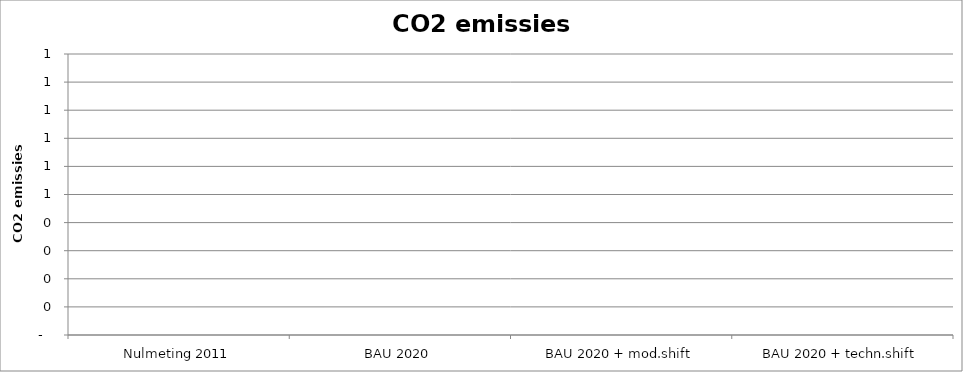
| Category | Series 0 |
|---|---|
| Nulmeting 2011 | 0 |
| BAU 2020 | 0 |
| BAU 2020 + mod.shift | 0 |
| BAU 2020 + techn.shift | 0 |